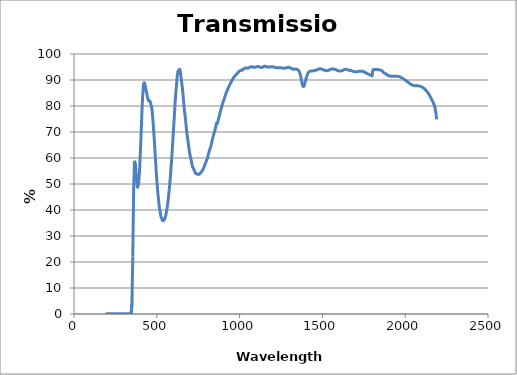
| Category | % Transmission |
|---|---|
| 190.0 | -0.127 |
| 195.0 | -0.063 |
| 200.0 | -0.025 |
| 205.0 | -0.017 |
| 210.0 | -0.011 |
| 215.0 | -0.008 |
| 220.0 | -0.006 |
| 225.0 | -0.002 |
| 230.0 | -0.001 |
| 235.0 | -0.001 |
| 240.0 | 0.001 |
| 245.0 | 0.001 |
| 250.0 | 0.001 |
| 255.0 | 0.001 |
| 260.0 | -0.001 |
| 265.0 | 0.002 |
| 270.0 | 0.002 |
| 275.0 | 0.002 |
| 280.0 | 0.006 |
| 285.0 | 0.004 |
| 290.0 | 0.009 |
| 295.0 | 0.009 |
| 300.0 | 0.012 |
| 305.0 | 0.011 |
| 310.0 | 0.008 |
| 315.0 | -0.004 |
| 320.0 | 0 |
| 325.0 | 0.006 |
| 330.0 | 0.001 |
| 335.0 | 0.002 |
| 340.0 | 0.001 |
| 345.0 | 0.085 |
| 350.0 | 4.144 |
| 355.0 | 22.086 |
| 360.0 | 46.918 |
| 365.0 | 58.89 |
| 370.0 | 58.381 |
| 375.0 | 53.837 |
| 380.0 | 50.058 |
| 385.0 | 48.698 |
| 390.0 | 50.268 |
| 395.0 | 54.531 |
| 400.0 | 60.935 |
| 405.0 | 68.965 |
| 410.0 | 77.291 |
| 415.0 | 84.238 |
| 420.0 | 88.196 |
| 425.0 | 88.968 |
| 430.0 | 87.822 |
| 435.0 | 86.185 |
| 440.0 | 84.649 |
| 445.0 | 83.045 |
| 450.0 | 82.039 |
| 455.0 | 82.01 |
| 460.0 | 81.732 |
| 465.0 | 80.431 |
| 470.0 | 78.936 |
| 475.0 | 75.941 |
| 480.0 | 71.552 |
| 485.0 | 66.922 |
| 490.0 | 61.441 |
| 495.0 | 56.43 |
| 500.0 | 51.731 |
| 505.0 | 47.521 |
| 510.0 | 44.251 |
| 515.0 | 41.29 |
| 520.0 | 39.351 |
| 525.0 | 37.528 |
| 530.0 | 36.698 |
| 535.0 | 35.914 |
| 540.0 | 36.054 |
| 545.0 | 36.165 |
| 550.0 | 37.163 |
| 555.0 | 38.157 |
| 560.0 | 39.999 |
| 565.0 | 42.041 |
| 570.0 | 44.619 |
| 575.0 | 47.841 |
| 580.0 | 51.17 |
| 585.0 | 55.527 |
| 590.0 | 59.724 |
| 595.0 | 64.804 |
| 600.0 | 70.238 |
| 605.0 | 75.17 |
| 610.0 | 80.653 |
| 615.0 | 85.249 |
| 620.0 | 88.751 |
| 625.0 | 92.408 |
| 630.0 | 93.614 |
| 635.0 | 93.863 |
| 640.0 | 93.962 |
| 645.0 | 91.709 |
| 650.0 | 89.126 |
| 655.0 | 86.664 |
| 660.0 | 83.175 |
| 665.0 | 79.544 |
| 670.0 | 76.613 |
| 675.0 | 73.791 |
| 680.0 | 70.426 |
| 685.0 | 67.984 |
| 690.0 | 65.71 |
| 695.0 | 63.23 |
| 700.0 | 61.289 |
| 705.0 | 59.904 |
| 710.0 | 58.451 |
| 715.0 | 56.805 |
| 720.0 | 56.082 |
| 725.0 | 55.425 |
| 730.0 | 54.649 |
| 735.0 | 54.042 |
| 740.0 | 53.895 |
| 745.0 | 53.857 |
| 750.0 | 53.644 |
| 755.0 | 53.701 |
| 760.0 | 53.936 |
| 765.0 | 54.424 |
| 770.0 | 54.748 |
| 775.0 | 55.223 |
| 780.0 | 55.732 |
| 785.0 | 56.491 |
| 790.0 | 57.425 |
| 795.0 | 58.142 |
| 800.0 | 59.041 |
| 805.0 | 59.767 |
| 810.0 | 61.136 |
| 815.0 | 62.255 |
| 820.0 | 63.285 |
| 825.0 | 64.214 |
| 830.0 | 65.439 |
| 835.0 | 67.01 |
| 840.0 | 68.29 |
| 845.0 | 69.394 |
| 850.0 | 70.421 |
| 855.0 | 71.771 |
| 860.0 | 73.379 |
| 865.0 | 73.145 |
| 870.0 | 74.412 |
| 875.0 | 75.624 |
| 880.0 | 76.896 |
| 885.0 | 78.135 |
| 890.0 | 79.316 |
| 895.0 | 80.416 |
| 900.0 | 81.447 |
| 905.0 | 82.402 |
| 910.0 | 83.383 |
| 915.0 | 84.334 |
| 920.0 | 85.219 |
| 925.0 | 86.041 |
| 930.0 | 86.767 |
| 935.0 | 87.453 |
| 940.0 | 88.109 |
| 945.0 | 88.741 |
| 950.0 | 89.335 |
| 955.0 | 89.938 |
| 960.0 | 90.522 |
| 965.0 | 91.027 |
| 970.0 | 91.449 |
| 975.0 | 91.803 |
| 980.0 | 92.115 |
| 985.0 | 92.456 |
| 990.0 | 92.86 |
| 995.0 | 93.209 |
| 1000.0 | 93.453 |
| 1005.0 | 93.594 |
| 1010.0 | 93.678 |
| 1015.0 | 93.832 |
| 1020.0 | 94.04 |
| 1025.0 | 94.263 |
| 1030.0 | 94.488 |
| 1035.0 | 94.614 |
| 1040.0 | 94.633 |
| 1045.0 | 94.579 |
| 1050.0 | 94.553 |
| 1055.0 | 94.656 |
| 1060.0 | 94.837 |
| 1065.0 | 94.976 |
| 1070.0 | 95.079 |
| 1075.0 | 95.099 |
| 1080.0 | 95.012 |
| 1085.0 | 94.914 |
| 1090.0 | 94.873 |
| 1095.0 | 94.918 |
| 1100.0 | 95.023 |
| 1105.0 | 95.126 |
| 1110.0 | 95.172 |
| 1115.0 | 95.125 |
| 1120.0 | 95.009 |
| 1125.0 | 94.915 |
| 1130.0 | 94.86 |
| 1135.0 | 94.849 |
| 1140.0 | 94.952 |
| 1145.0 | 95.145 |
| 1150.0 | 95.258 |
| 1155.0 | 95.254 |
| 1160.0 | 95.191 |
| 1165.0 | 95.09 |
| 1170.0 | 95.006 |
| 1175.0 | 94.975 |
| 1180.0 | 94.999 |
| 1185.0 | 95.036 |
| 1190.0 | 95.055 |
| 1195.0 | 95.073 |
| 1200.0 | 95.068 |
| 1205.0 | 95.021 |
| 1210.0 | 94.937 |
| 1215.0 | 94.844 |
| 1220.0 | 94.767 |
| 1225.0 | 94.726 |
| 1230.0 | 94.693 |
| 1235.0 | 94.689 |
| 1240.0 | 94.694 |
| 1245.0 | 94.703 |
| 1250.0 | 94.676 |
| 1255.0 | 94.642 |
| 1260.0 | 94.591 |
| 1265.0 | 94.554 |
| 1270.0 | 94.549 |
| 1275.0 | 94.584 |
| 1280.0 | 94.675 |
| 1285.0 | 94.772 |
| 1290.0 | 94.863 |
| 1295.0 | 94.899 |
| 1300.0 | 94.833 |
| 1305.0 | 94.716 |
| 1310.0 | 94.546 |
| 1315.0 | 94.366 |
| 1320.0 | 94.23 |
| 1325.0 | 94.171 |
| 1330.0 | 94.168 |
| 1335.0 | 94.205 |
| 1340.0 | 94.198 |
| 1345.0 | 94.12 |
| 1350.0 | 93.969 |
| 1355.0 | 93.721 |
| 1360.0 | 93.278 |
| 1365.0 | 92.426 |
| 1370.0 | 91.093 |
| 1375.0 | 89.446 |
| 1380.0 | 88.026 |
| 1385.0 | 87.445 |
| 1390.0 | 87.842 |
| 1395.0 | 88.914 |
| 1400.0 | 90.151 |
| 1405.0 | 91.293 |
| 1410.0 | 92.21 |
| 1415.0 | 92.823 |
| 1420.0 | 93.198 |
| 1425.0 | 93.391 |
| 1430.0 | 93.461 |
| 1435.0 | 93.489 |
| 1440.0 | 93.504 |
| 1445.0 | 93.537 |
| 1450.0 | 93.601 |
| 1455.0 | 93.701 |
| 1460.0 | 93.77 |
| 1465.0 | 93.885 |
| 1470.0 | 94.005 |
| 1475.0 | 94.141 |
| 1480.0 | 94.257 |
| 1485.0 | 94.315 |
| 1490.0 | 94.285 |
| 1495.0 | 94.192 |
| 1500.0 | 94.079 |
| 1505.0 | 93.955 |
| 1510.0 | 93.844 |
| 1515.0 | 93.721 |
| 1520.0 | 93.605 |
| 1525.0 | 93.577 |
| 1530.0 | 93.634 |
| 1535.0 | 93.705 |
| 1540.0 | 93.814 |
| 1545.0 | 93.954 |
| 1550.0 | 94.153 |
| 1555.0 | 94.232 |
| 1560.0 | 94.28 |
| 1565.0 | 94.247 |
| 1570.0 | 94.201 |
| 1575.0 | 94.068 |
| 1580.0 | 93.965 |
| 1585.0 | 93.828 |
| 1590.0 | 93.69 |
| 1595.0 | 93.587 |
| 1600.0 | 93.516 |
| 1605.0 | 93.458 |
| 1610.0 | 93.454 |
| 1615.0 | 93.495 |
| 1620.0 | 93.563 |
| 1625.0 | 93.778 |
| 1630.0 | 94.008 |
| 1635.0 | 94.094 |
| 1640.0 | 94.111 |
| 1645.0 | 94.018 |
| 1650.0 | 93.947 |
| 1655.0 | 93.893 |
| 1660.0 | 93.795 |
| 1665.0 | 93.631 |
| 1670.0 | 93.727 |
| 1675.0 | 93.601 |
| 1680.0 | 93.467 |
| 1685.0 | 93.337 |
| 1690.0 | 93.234 |
| 1695.0 | 93.168 |
| 1700.0 | 93.15 |
| 1705.0 | 93.175 |
| 1710.0 | 93.186 |
| 1715.0 | 93.23 |
| 1720.0 | 93.318 |
| 1725.0 | 93.357 |
| 1730.0 | 93.391 |
| 1735.0 | 93.395 |
| 1740.0 | 93.399 |
| 1745.0 | 93.331 |
| 1750.0 | 93.161 |
| 1755.0 | 92.99 |
| 1760.0 | 92.838 |
| 1765.0 | 92.664 |
| 1770.0 | 92.479 |
| 1775.0 | 92.321 |
| 1780.0 | 92.174 |
| 1785.0 | 92.056 |
| 1790.0 | 91.941 |
| 1795.0 | 91.795 |
| 1800.0 | 91.696 |
| 1805.0 | 93.836 |
| 1810.0 | 93.904 |
| 1815.0 | 93.98 |
| 1820.0 | 94.034 |
| 1825.0 | 94.066 |
| 1830.0 | 94.078 |
| 1835.0 | 94.039 |
| 1840.0 | 93.968 |
| 1845.0 | 93.889 |
| 1850.0 | 93.805 |
| 1855.0 | 93.717 |
| 1860.0 | 93.545 |
| 1865.0 | 93.203 |
| 1870.0 | 92.846 |
| 1875.0 | 92.644 |
| 1880.0 | 92.491 |
| 1885.0 | 92.299 |
| 1890.0 | 92.078 |
| 1895.0 | 91.841 |
| 1900.0 | 91.658 |
| 1905.0 | 91.572 |
| 1910.0 | 91.522 |
| 1915.0 | 91.473 |
| 1920.0 | 91.456 |
| 1925.0 | 91.467 |
| 1930.0 | 91.461 |
| 1935.0 | 91.452 |
| 1940.0 | 91.465 |
| 1945.0 | 91.469 |
| 1950.0 | 91.459 |
| 1955.0 | 91.419 |
| 1960.0 | 91.353 |
| 1965.0 | 91.247 |
| 1970.0 | 91.126 |
| 1975.0 | 90.976 |
| 1980.0 | 90.792 |
| 1985.0 | 90.604 |
| 1990.0 | 90.42 |
| 1995.0 | 90.208 |
| 2000.0 | 89.976 |
| 2005.0 | 89.765 |
| 2010.0 | 89.524 |
| 2015.0 | 89.257 |
| 2020.0 | 89.02 |
| 2025.0 | 88.773 |
| 2030.0 | 88.534 |
| 2035.0 | 88.322 |
| 2040.0 | 88.15 |
| 2045.0 | 88.021 |
| 2050.0 | 87.92 |
| 2055.0 | 87.838 |
| 2060.0 | 87.783 |
| 2065.0 | 87.759 |
| 2070.0 | 87.75 |
| 2075.0 | 87.744 |
| 2080.0 | 87.736 |
| 2085.0 | 87.69 |
| 2090.0 | 87.599 |
| 2095.0 | 87.49 |
| 2100.0 | 87.35 |
| 2105.0 | 87.171 |
| 2110.0 | 86.937 |
| 2115.0 | 86.684 |
| 2120.0 | 86.372 |
| 2125.0 | 86.031 |
| 2130.0 | 85.663 |
| 2135.0 | 85.253 |
| 2140.0 | 84.803 |
| 2145.0 | 84.304 |
| 2150.0 | 83.745 |
| 2155.0 | 83.144 |
| 2160.0 | 82.505 |
| 2165.0 | 81.868 |
| 2170.0 | 81.189 |
| 2175.0 | 80.37 |
| 2180.0 | 79.24 |
| 2185.0 | 77.503 |
| 2190.0 | 74.859 |